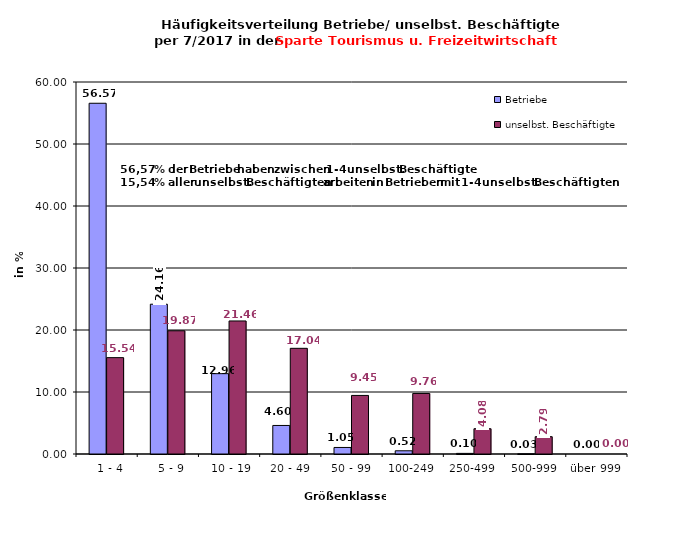
| Category | Betriebe | unselbst. Beschäftigte |
|---|---|---|
|   1 - 4 | 56.571 | 15.544 |
|   5 - 9 | 24.159 | 19.874 |
|  10 - 19 | 12.958 | 21.457 |
| 20 - 49 | 4.604 | 17.045 |
| 50 - 99 | 1.055 | 9.447 |
| 100-249 | 0.519 | 9.765 |
| 250-499 | 0.1 | 4.076 |
| 500-999 | 0.033 | 2.791 |
| über 999 | 0 | 0 |